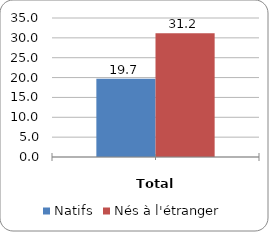
| Category | Natifs | Nés à l'étranger |
|---|---|---|
|  | 19.693 | 31.158 |